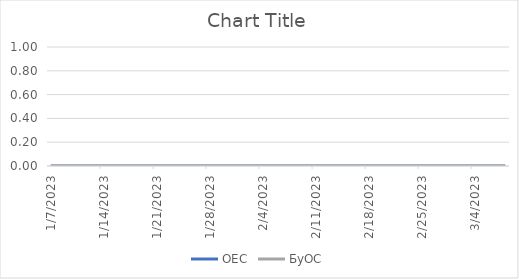
| Category | ОЕС | БуОС |
|---|---|---|
| 3/8/23 | 0 | 0 |
| 3/7/23 | 0 | 0 |
| 3/6/23 | 0 | 0 |
| 3/5/23 | 0 | 0 |
| 3/4/23 | 0 | 0 |
| 3/3/23 | 0 | 0 |
| 3/2/23 | 0 | 0 |
| 3/1/23 | 0 | 0 |
| 2/28/23 | 0 | 0 |
| 2/27/23 | 0 | 0 |
| 2/26/23 | 0 | 0 |
| 2/25/23 | 0 | 0 |
| 2/24/23 | 0 | 0 |
| 2/23/23 | 0 | 0 |
| 2/22/23 | 0 | 0 |
| 2/21/23 | 0 | 0 |
| 2/20/23 | 0 | 0 |
| 2/19/23 | 0 | 0 |
| 2/18/23 | 0 | 0 |
| 2/17/23 | 0 | 0 |
| 2/16/23 | 0 | 0 |
| 2/15/23 | 0 | 0 |
| 2/14/23 | 0 | 0 |
| 2/13/23 | 0 | 0 |
| 2/12/23 | 0 | 0 |
| 2/11/23 | 0 | 0 |
| 2/10/23 | 0 | 0 |
| 2/9/23 | 0 | 0 |
| 2/8/23 | 0 | 0 |
| 2/7/23 | 0 | 0 |
| 2/6/23 | 0 | 0 |
| 2/5/23 | 0 | 0 |
| 2/4/23 | 0 | 0 |
| 2/3/23 | 0 | 0 |
| 2/2/23 | 0 | 0 |
| 2/1/23 | 0 | 0 |
| 1/31/23 | 0 | 0 |
| 1/30/23 | 0 | 0 |
| 1/29/23 | 0 | 0 |
| 1/28/23 | 0 | 0 |
| 1/27/23 | 0 | 0 |
| 1/26/23 | 0 | 0 |
| 1/25/23 | 0 | 0 |
| 1/24/23 | 0 | 0 |
| 1/23/23 | 0 | 0 |
| 1/22/23 | 0 | 0 |
| 1/21/23 | 0 | 0 |
| 1/20/23 | 0 | 0 |
| 1/19/23 | 0 | 0 |
| 1/18/23 | 0 | 0 |
| 1/17/23 | 0 | 0 |
| 1/16/23 | 0 | 0 |
| 1/15/23 | 0 | 0 |
| 1/14/23 | 0 | 0 |
| 1/13/23 | 0 | 0 |
| 1/12/23 | 0 | 0 |
| 1/11/23 | 0 | 0 |
| 1/10/23 | 0 | 0 |
| 1/9/23 | 0 | 0 |
| 1/8/23 | 0 | 0 |
| 1/7/23 | 0 | 0 |